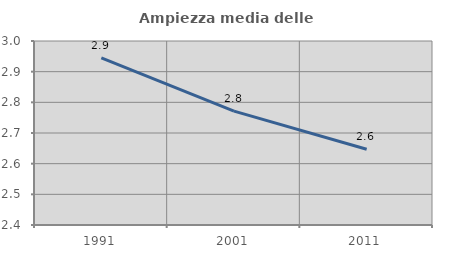
| Category | Ampiezza media delle famiglie |
|---|---|
| 1991.0 | 2.945 |
| 2001.0 | 2.771 |
| 2011.0 | 2.647 |